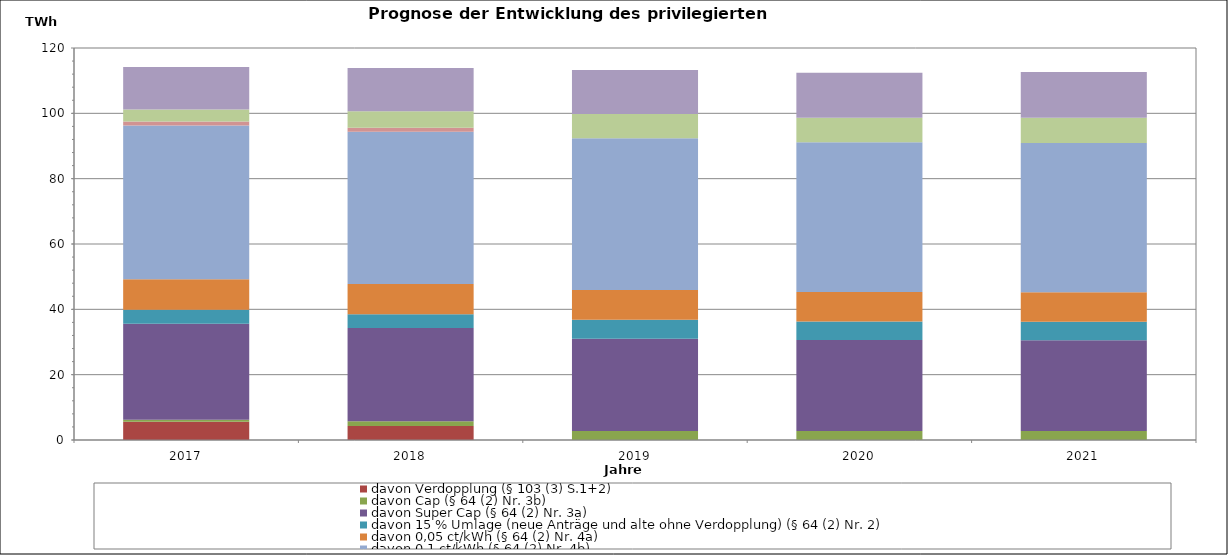
| Category | davon Verdopplung (§ 103 (3) S.1+2) | davon Cap (§ 64 (2) Nr. 3b) | davon Super Cap (§ 64 (2) Nr. 3a) | davon 15 % Umlage (neue Anträge und alte ohne Verdopplung) (§ 64 (2) Nr. 2) | davon 0,05 ct/kWh (§ 64 (2) Nr. 4a) | davon 0,1 ct/kWh (§ 64 (2) Nr. 4b) | davon Verdopplung (§ 103 (4) i.V.m. §103 (3)) | davon 20 % | Schienenbahnen (§ 65 (2)) |
|---|---|---|---|---|---|---|---|---|---|
| 2017.0 | 5.601 | 0.6 | 29.394 | 4.253 | 9.339 | 47.093 | 1.257 | 3.623 | 12.986 |
| 2018.0 | 4.272 | 1.502 | 28.546 | 4.174 | 9.236 | 46.624 | 1.244 | 5.065 | 13.246 |
| 2019.0 | 0 | 2.792 | 28.234 | 5.756 | 9.142 | 46.409 | 0 | 7.424 | 13.511 |
| 2020.0 | 0 | 2.755 | 27.857 | 5.68 | 9.022 | 45.799 | 0 | 7.516 | 13.781 |
| 2021.0 | 0 | 2.75 | 27.804 | 5.67 | 9.003 | 45.713 | 0 | 7.684 | 14.057 |